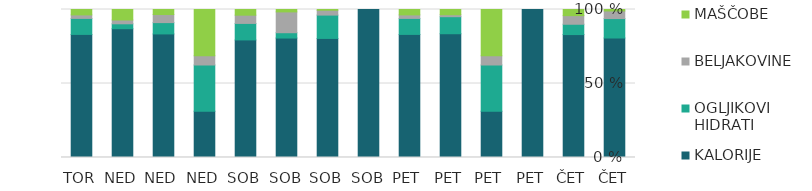
| Category | KALORIJE | OGLJIKOVI HIDRATI | BELJAKOVINE | MAŠČOBE |
|---|---|---|---|---|
| ČET | 283 | 46 | 18 | 3.5 |
| ČET | 500 | 42 | 35 | 25 |
| PET | 1 | 0 | 0 | 0 |
| PET | 10 | 10 | 2 | 10 |
| PET | 189 | 26 | 3 | 8 |
| PET | 477 | 62 | 13.5 | 21 |
| SOB | 1 | 0 | 0 | 0 |
| SOB | 245 | 48 | 10 | 1.5 |
| SOB | 247 | 11 | 43 | 5 |
| SOB | 456 | 64 | 32 | 22 |
| NED | 10 | 10 | 2 | 10 |
| NED | 135 | 12.36 | 8.81 | 5.51 |
| NED | 184 | 7 | 5.43 | 15 |
| TOR | 477 | 62 | 13.5 | 21 |